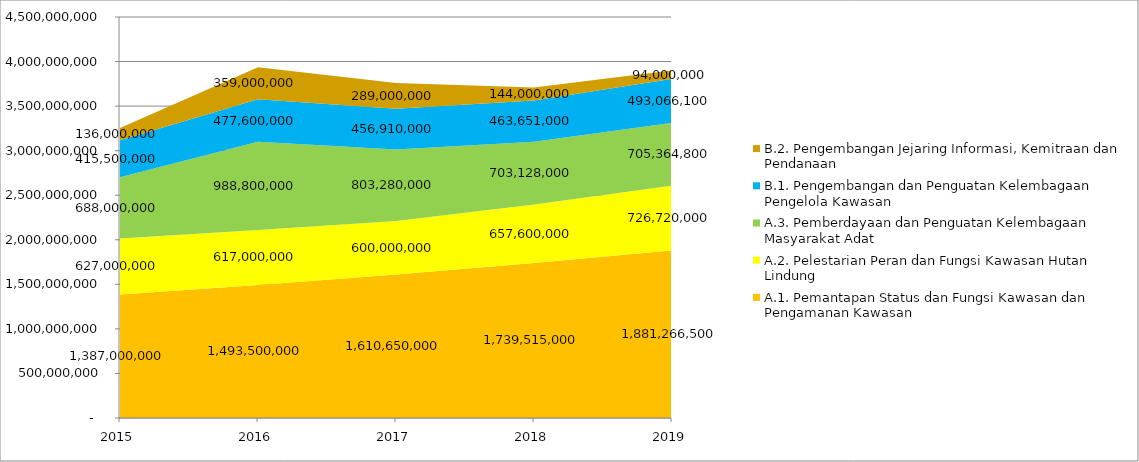
| Category | A.1. Pemantapan Status dan Fungsi Kawasan dan Pengamanan Kawasan | A.2. Pelestarian Peran dan Fungsi Kawasan Hutan Lindung | A.3. Pemberdayaan dan Penguatan Kelembagaan Masyarakat Adat  | B.1. Pengembangan dan Penguatan Kelembagaan Pengelola Kawasan  | B.2. Pengembangan Jejaring Informasi, Kemitraan dan Pendanaan |
|---|---|---|---|---|---|
|  2015  | 1387000000 | 627000000 | 688000000 | 415500000 | 136000000 |
|  2016  | 1493500000 | 617000000 | 988800000 | 477600000 | 359000000 |
|  2017  | 1610650000 | 600000000 | 803280000 | 456910000 | 289000000 |
|  2018  | 1739515000 | 657600000 | 703128000 | 463651000 | 144000000 |
|  2019  | 1881266500 | 726720000 | 705364800 | 493066100 | 94000000 |